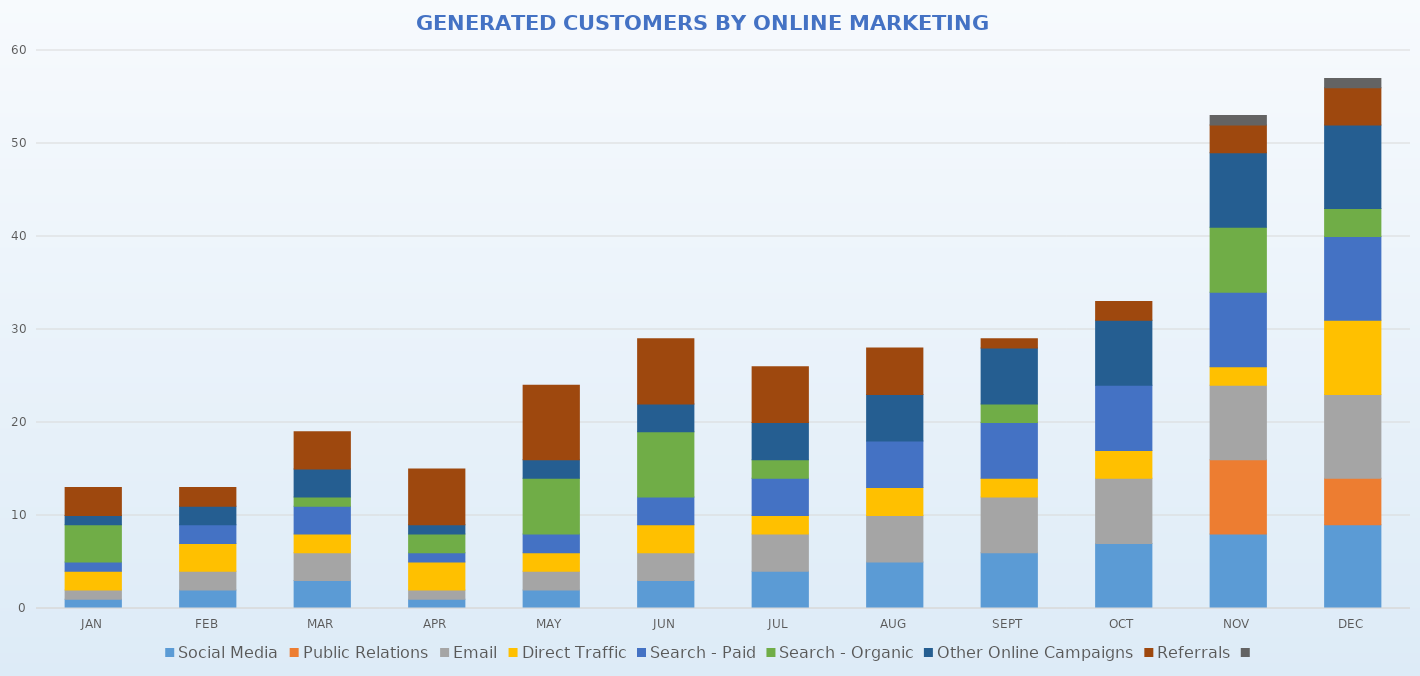
| Category | Social Media | Public Relations | Email | Direct Traffic | Search - Paid | Search - Organic | Other Online Campaigns | Referrals | Series 8 |
|---|---|---|---|---|---|---|---|---|---|
| JAN | 1 | 0 | 1 | 2 | 1 | 4 | 1 | 3 | 0 |
| FEB | 2 | 0 | 2 | 3 | 2 | 0 | 2 | 2 | 0 |
| MAR | 3 | 0 | 3 | 2 | 3 | 1 | 3 | 4 | 0 |
| APR | 1 | 0 | 1 | 3 | 1 | 2 | 1 | 6 | 0 |
| MAY | 2 | 0 | 2 | 2 | 2 | 6 | 2 | 8 | 0 |
| JUN | 3 | 0 | 3 | 3 | 3 | 7 | 3 | 7 | 0 |
| JUL | 4 | 0 | 4 | 2 | 4 | 2 | 4 | 6 | 0 |
| AUG | 5 | 0 | 5 | 3 | 5 | 0 | 5 | 5 | 0 |
| SEPT | 6 | 0 | 6 | 2 | 6 | 2 | 6 | 1 | 0 |
| OCT | 7 | 0 | 7 | 3 | 7 | 0 | 7 | 2 | 0 |
| NOV | 8 | 8 | 8 | 2 | 8 | 7 | 8 | 3 | 1 |
| DEC | 9 | 5 | 9 | 8 | 9 | 3 | 9 | 4 | 1 |